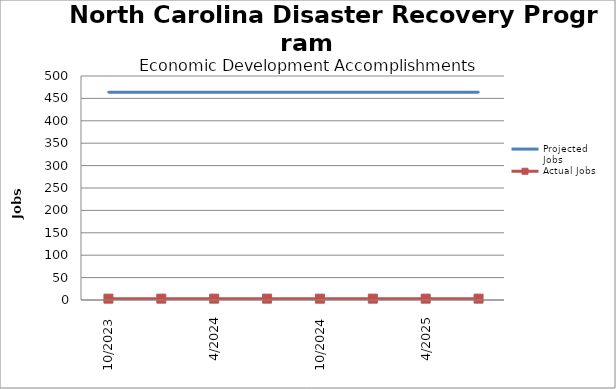
| Category | Projected Jobs | Actual Jobs |
|---|---|---|
| 10/2023 | 464 | 3 |
| 01/2024 | 464 | 3 |
| 4/2024 | 464 | 3 |
| 07/2024 | 464 | 3 |
| 10/2024 | 464 | 3 |
| 01/2025 | 464 | 3 |
| 4/2025 | 464 | 3 |
| 07/2025 | 464 | 3 |